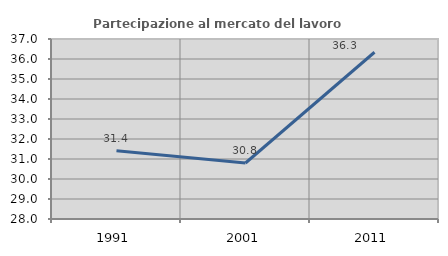
| Category | Partecipazione al mercato del lavoro  femminile |
|---|---|
| 1991.0 | 31.418 |
| 2001.0 | 30.799 |
| 2011.0 | 36.338 |